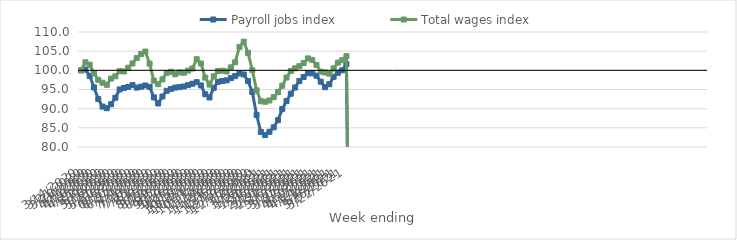
| Category | Payroll jobs index | Total wages index |
|---|---|---|
| 14/03/2020 | 100 | 100 |
| 21/03/2020 | 100.212 | 102.114 |
| 28/03/2020 | 98.554 | 101.462 |
| 04/04/2020 | 95.541 | 99.239 |
| 11/04/2020 | 92.51 | 97.515 |
| 18/04/2020 | 90.533 | 96.78 |
| 25/04/2020 | 90.113 | 96.215 |
| 02/05/2020 | 91.152 | 97.848 |
| 09/05/2020 | 92.852 | 98.445 |
| 16/05/2020 | 95.021 | 99.798 |
| 23/05/2020 | 95.393 | 99.7 |
| 30/05/2020 | 95.651 | 100.663 |
| 06/06/2020 | 96.15 | 101.783 |
| 13/06/2020 | 95.5 | 103.219 |
| 20/06/2020 | 95.727 | 104.235 |
| 27/06/2020 | 96.047 | 104.899 |
| 04/07/2020 | 95.683 | 101.754 |
| 11/07/2020 | 92.938 | 97.288 |
| 18/07/2020 | 91.343 | 96.384 |
| 25/07/2020 | 93.18 | 97.653 |
| 01/08/2020 | 94.668 | 99.349 |
| 08/08/2020 | 95.146 | 99.622 |
| 15/08/2020 | 95.499 | 98.969 |
| 22/08/2020 | 95.63 | 99.449 |
| 29/08/2020 | 95.788 | 99.37 |
| 05/09/2020 | 96.142 | 99.913 |
| 12/09/2020 | 96.498 | 100.468 |
| 19/09/2020 | 96.916 | 102.895 |
| 26/09/2020 | 96.064 | 101.787 |
| 03/10/2020 | 93.77 | 98.094 |
| 10/10/2020 | 92.92 | 96.287 |
| 17/10/2020 | 95.451 | 98.431 |
| 24/10/2020 | 97.002 | 99.83 |
| 31/10/2020 | 97.233 | 99.901 |
| 07/11/2020 | 97.386 | 99.698 |
| 14/11/2020 | 97.964 | 100.771 |
| 21/11/2020 | 98.495 | 102.103 |
| 28/11/2020 | 99.191 | 106.124 |
| 05/12/2020 | 98.928 | 107.471 |
| 12/12/2020 | 97.206 | 104.541 |
| 19/12/2020 | 94.351 | 100.056 |
| 26/12/2020 | 88.359 | 94.782 |
| 02/01/2021 | 83.92 | 91.944 |
| 09/01/2021 | 83.111 | 91.802 |
| 16/01/2021 | 83.953 | 92.138 |
| 23/01/2021 | 85.14 | 93.019 |
| 30/01/2021 | 86.998 | 94.306 |
| 06/02/2021 | 89.882 | 95.992 |
| 13/02/2021 | 91.99 | 98.13 |
| 20/02/2021 | 93.889 | 99.828 |
| 27/02/2021 | 95.525 | 100.534 |
| 06/03/2021 | 97.205 | 101.093 |
| 13/03/2021 | 98.265 | 101.9 |
| 20/03/2021 | 99.256 | 103.119 |
| 27/03/2021 | 99.219 | 102.726 |
| 03/04/2021 | 98.594 | 101.395 |
| 10/04/2021 | 97.038 | 99.641 |
| 17/04/2021 | 95.6 | 99.44 |
| 24/04/2021 | 96.364 | 99.117 |
| 01/05/2021 | 98.316 | 100.509 |
| 08/05/2021 | 99.355 | 102.003 |
| 15/05/2021 | 99.998 | 102.623 |
| 22/05/2021 | 101.617 | 103.694 |